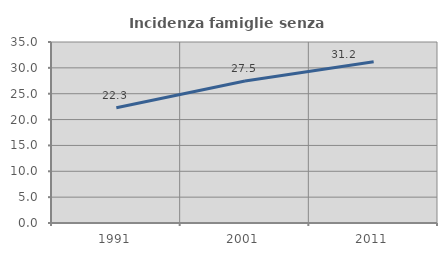
| Category | Incidenza famiglie senza nuclei |
|---|---|
| 1991.0 | 22.302 |
| 2001.0 | 27.456 |
| 2011.0 | 31.175 |